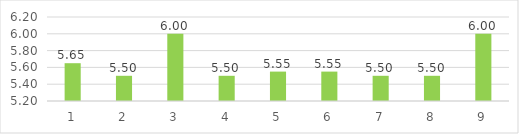
| Category | Series 0 |
|---|---|
| 0 | 5.65 |
| 1 | 5.5 |
| 2 | 6 |
| 3 | 5.5 |
| 4 | 5.55 |
| 5 | 5.55 |
| 6 | 5.5 |
| 7 | 5.5 |
| 8 | 6 |